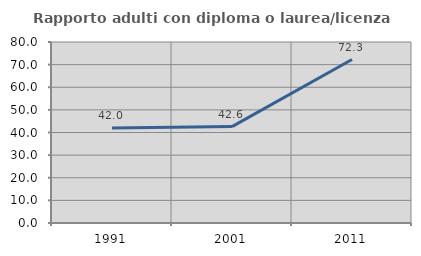
| Category | Rapporto adulti con diploma o laurea/licenza media  |
|---|---|
| 1991.0 | 42.007 |
| 2001.0 | 42.607 |
| 2011.0 | 72.259 |